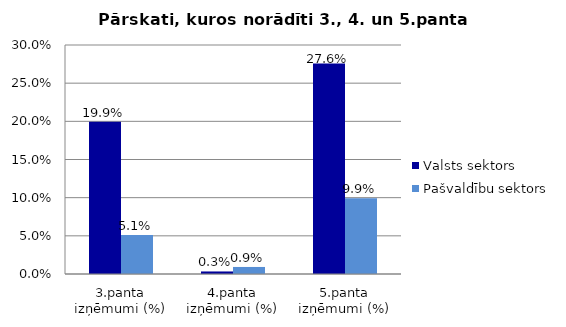
| Category | Valsts sektors | Pašvaldību sektors |
|---|---|---|
| 3.panta izņēmumi (%) | 0.199 | 0.051 |
| 4.panta izņēmumi (%) | 0.003 | 0.009 |
| 5.panta izņēmumi (%) | 0.276 | 0.099 |